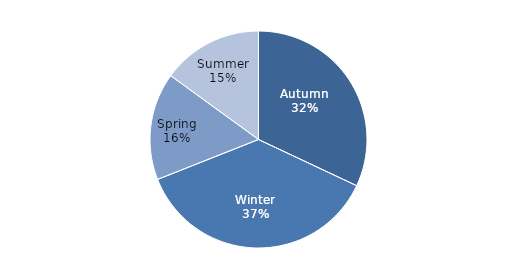
| Category | Series 0 |
|---|---|
| Autumn | 32 |
| Winter | 37 |
| Spring | 16 |
| Summer | 15 |